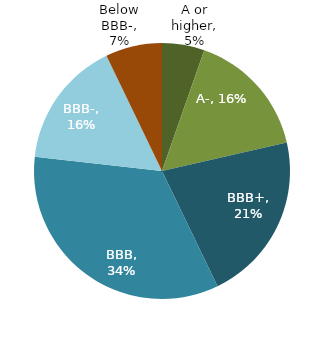
| Category | Series 0 |
|---|---|
| A or higher | 0.054 |
| A- | 0.161 |
| BBB+ | 0.214 |
| BBB | 0.339 |
| BBB- | 0.161 |
| Below BBB- | 0.071 |